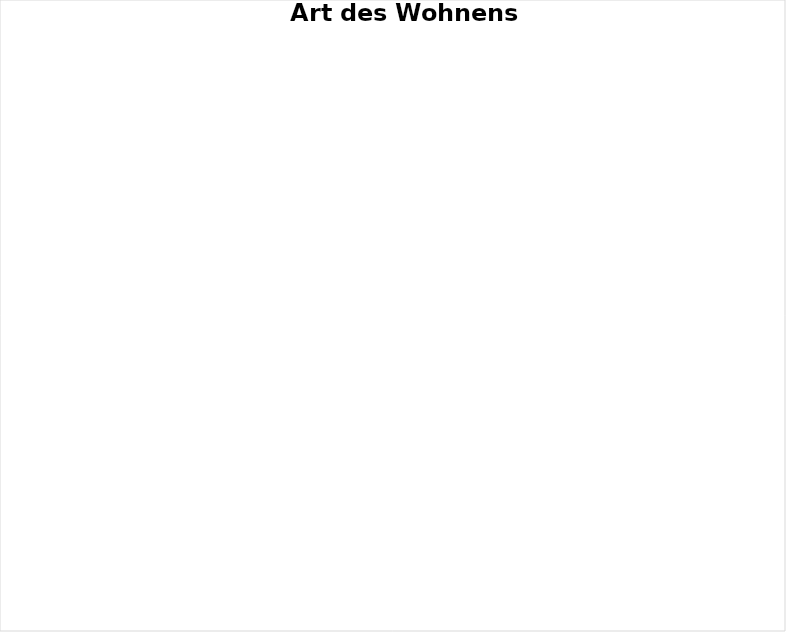
| Category | Series 0 |
|---|---|
| Wohnen intensive Betreuung | 0 |
| Wohnen normale Betreung | 0 |
| Wohnbegleitung | 0 |
| Wohnbegleitung in Traingswohnung | 0 |
| Aussenwohngruppe ohne Betreuung  | 0 |
| Sehbehindertenspezifisches Wohnen | 0 |
| Wohncoaching | 0 |